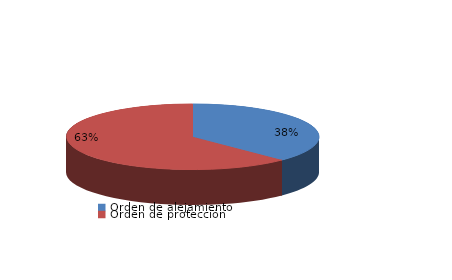
| Category | Series 0 |
|---|---|
| Orden de alejamiento | 12 |
| Orden de protección | 20 |